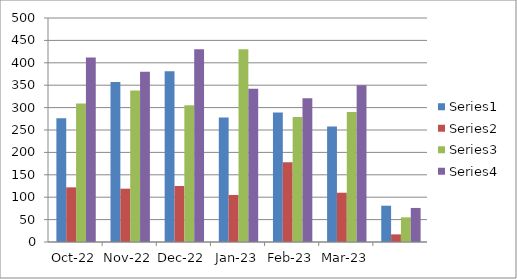
| Category | Series 0 | Series 1 | Series 2 | Series 3 |
|---|---|---|---|---|
| 2022-10-29 | 276 | 122 | 309 | 412 |
| 2022-11-29 | 357 | 119 | 338 | 380 |
| 2022-12-29 | 381 | 125 | 305 | 430 |
| 2023-01-29 | 278 | 105 | 430 | 342 |
| 2023-02-28 | 289 | 178 | 279 | 321 |
| 2023-03-29 | 258 | 110 | 290 | 350 |
| 2023-04-27 | 81 | 17 | 55 | 76 |